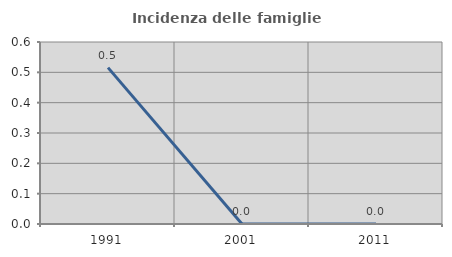
| Category | Incidenza delle famiglie numerose |
|---|---|
| 1991.0 | 0.515 |
| 2001.0 | 0 |
| 2011.0 | 0 |